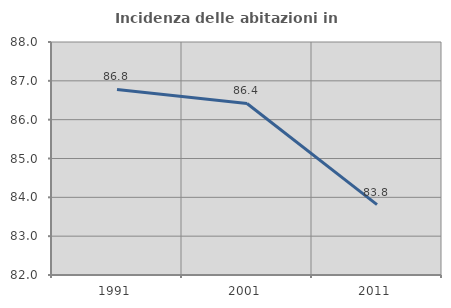
| Category | Incidenza delle abitazioni in proprietà  |
|---|---|
| 1991.0 | 86.78 |
| 2001.0 | 86.417 |
| 2011.0 | 83.814 |